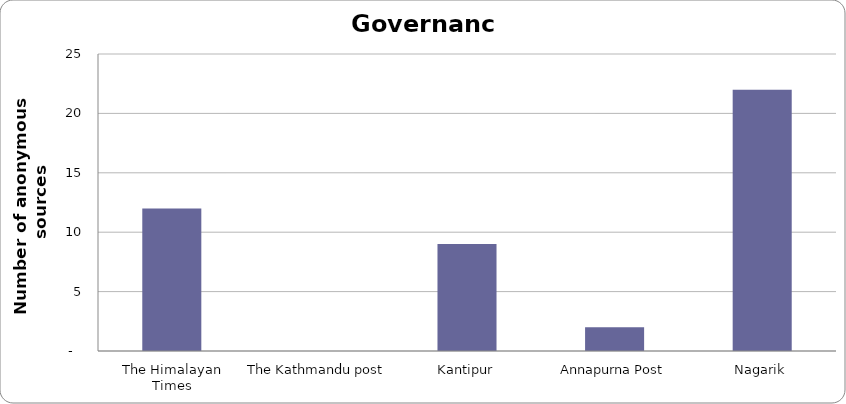
| Category | Governance |
|---|---|
| The Himalayan Times | 12 |
| The Kathmandu post | 0 |
| Kantipur | 9 |
| Annapurna Post | 2 |
| Nagarik | 22 |